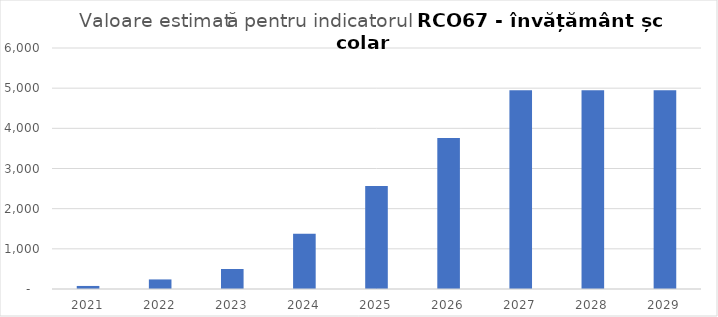
| Category | Series 0 |
|---|---|
| 2021.0 | 75.781 |
| 2022.0 | 238.167 |
| 2023.0 | 497.986 |
| 2024.0 | 1374.876 |
| 2025.0 | 2565.713 |
| 2026.0 | 3756.55 |
| 2027.0 | 4947.387 |
| 2028.0 | 4947.387 |
| 2029.0 | 4947.387 |